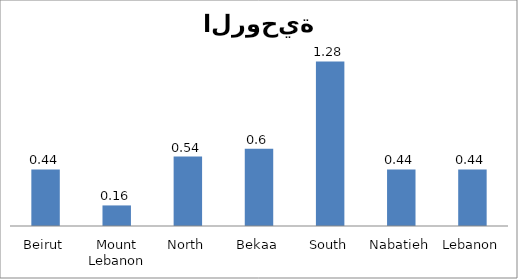
| Category | 01 |
|---|---|
| Beirut | 0.44 |
| Mount Lebanon | 0.16 |
| North | 0.54 |
| Bekaa | 0.6 |
| South | 1.28 |
| Nabatieh | 0.44 |
| Lebanon | 0.44 |